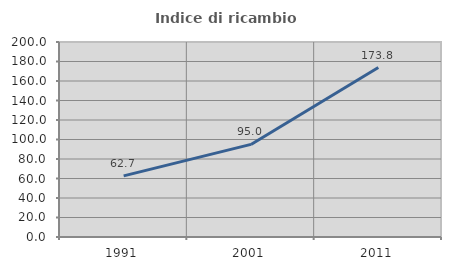
| Category | Indice di ricambio occupazionale  |
|---|---|
| 1991.0 | 62.722 |
| 2001.0 | 94.964 |
| 2011.0 | 173.77 |